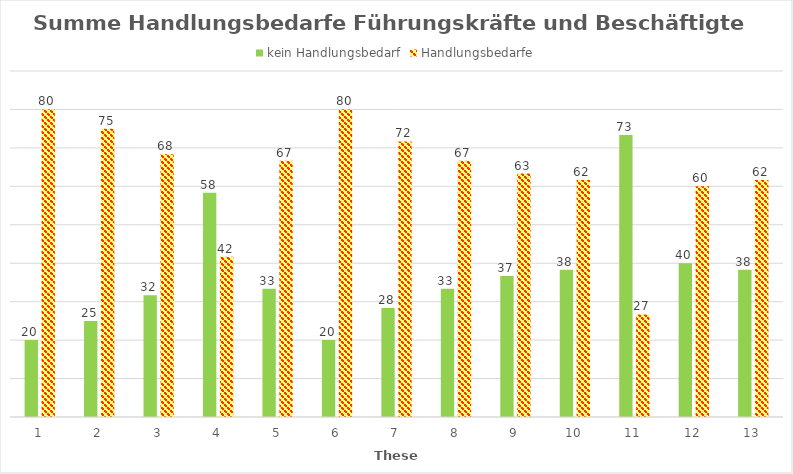
| Category | kein Handlungsbedarf | Handlungsbedarfe |
|---|---|---|
| 1.0 | 20 | 80 |
| 2.0 | 25 | 75 |
| 3.0 | 31.667 | 68.333 |
| 4.0 | 58.333 | 41.667 |
| 5.0 | 33.333 | 66.667 |
| 6.0 | 20 | 80 |
| 7.0 | 28.333 | 71.667 |
| 8.0 | 33.333 | 66.667 |
| 9.0 | 36.667 | 63.333 |
| 10.0 | 38.333 | 61.667 |
| 11.0 | 73.333 | 26.667 |
| 12.0 | 40 | 60 |
| 13.0 | 38.333 | 61.667 |